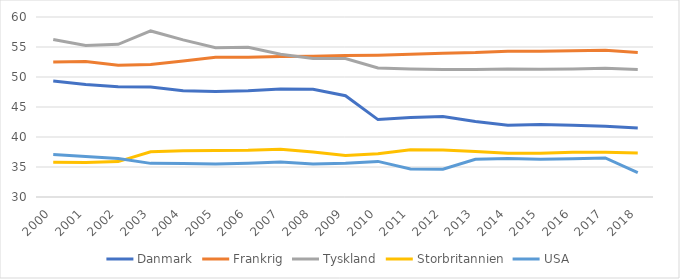
| Category | Danmark | Frankrig | Tyskland | Storbritannien | USA |
|---|---|---|---|---|---|
| 2000 | 49.322 | 52.495 | 56.246 | 35.804 | 37.078 |
| 2001 | 48.76 | 52.596 | 55.243 | 35.758 | 36.764 |
| 2002 | 48.388 | 51.958 | 55.438 | 35.899 | 36.397 |
| 2003 | 48.332 | 52.096 | 57.678 | 37.547 | 35.605 |
| 2004 | 47.72 | 52.678 | 56.186 | 37.697 | 35.577 |
| 2005 | 47.563 | 53.294 | 54.882 | 37.734 | 35.5 |
| 2006 | 47.708 | 53.312 | 54.956 | 37.78 | 35.619 |
| 2007 | 47.98 | 53.401 | 53.785 | 37.968 | 35.84 |
| 2008 | 47.962 | 53.446 | 53.101 | 37.506 | 35.493 |
| 2009 | 46.877 | 53.563 | 53.088 | 36.929 | 35.624 |
| 2010 | 42.902 | 53.623 | 51.491 | 37.216 | 35.933 |
| 2011 | 43.231 | 53.793 | 51.323 | 37.894 | 34.654 |
| 2012 | 43.398 | 53.977 | 51.244 | 37.829 | 34.639 |
| 2013 | 42.58 | 54.069 | 51.238 | 37.597 | 36.301 |
| 2014 | 41.947 | 54.296 | 51.343 | 37.303 | 36.413 |
| 2015 | 42.067 | 54.282 | 51.304 | 37.293 | 36.3 |
| 2016 | 41.951 | 54.376 | 51.336 | 37.45 | 36.388 |
| 2017 | 41.777 | 54.448 | 51.465 | 37.46 | 36.507 |
| 2018 | 41.508 | 54.087 | 51.255 | 37.334 | 34.078 |